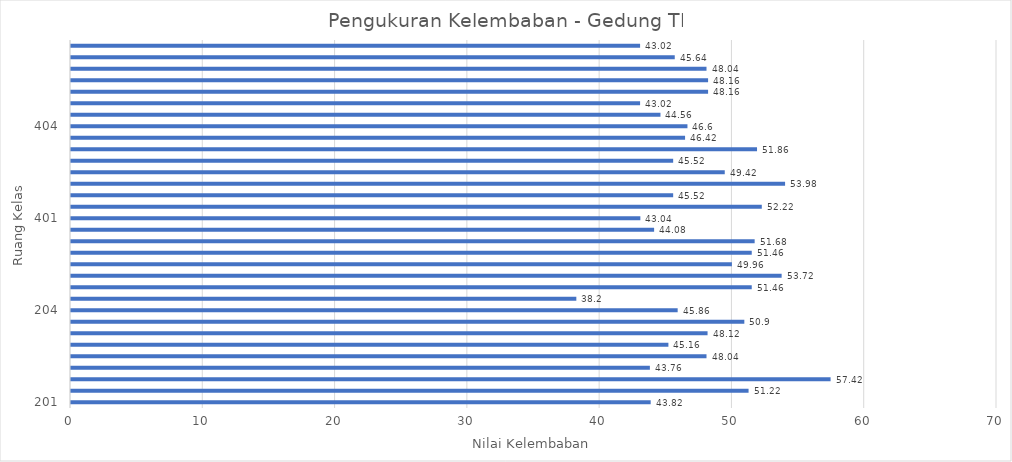
| Category | Series 0 |
|---|---|
| 201.0 | 43.82 |
| nan | 51.22 |
| nan | 57.42 |
| nan | 43.76 |
| nan | 48.04 |
| nan | 45.16 |
| nan | 48.12 |
| nan | 50.9 |
| 204.0 | 45.86 |
| nan | 38.2 |
| nan | 51.46 |
| nan | 53.72 |
| nan | 49.96 |
| nan | 51.46 |
| nan | 51.68 |
| nan | 44.08 |
| 401.0 | 43.04 |
| nan | 52.22 |
| nan | 45.52 |
| nan | 53.98 |
| nan | 49.42 |
| nan | 45.52 |
| nan | 51.86 |
| nan | 46.42 |
| 404.0 | 46.6 |
| nan | 44.56 |
| nan | 43.02 |
| nan | 48.16 |
| nan | 48.16 |
| nan | 48.04 |
| nan | 45.64 |
| nan | 43.02 |